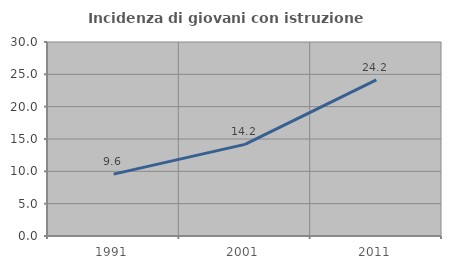
| Category | Incidenza di giovani con istruzione universitaria |
|---|---|
| 1991.0 | 9.565 |
| 2001.0 | 14.167 |
| 2011.0 | 24.157 |